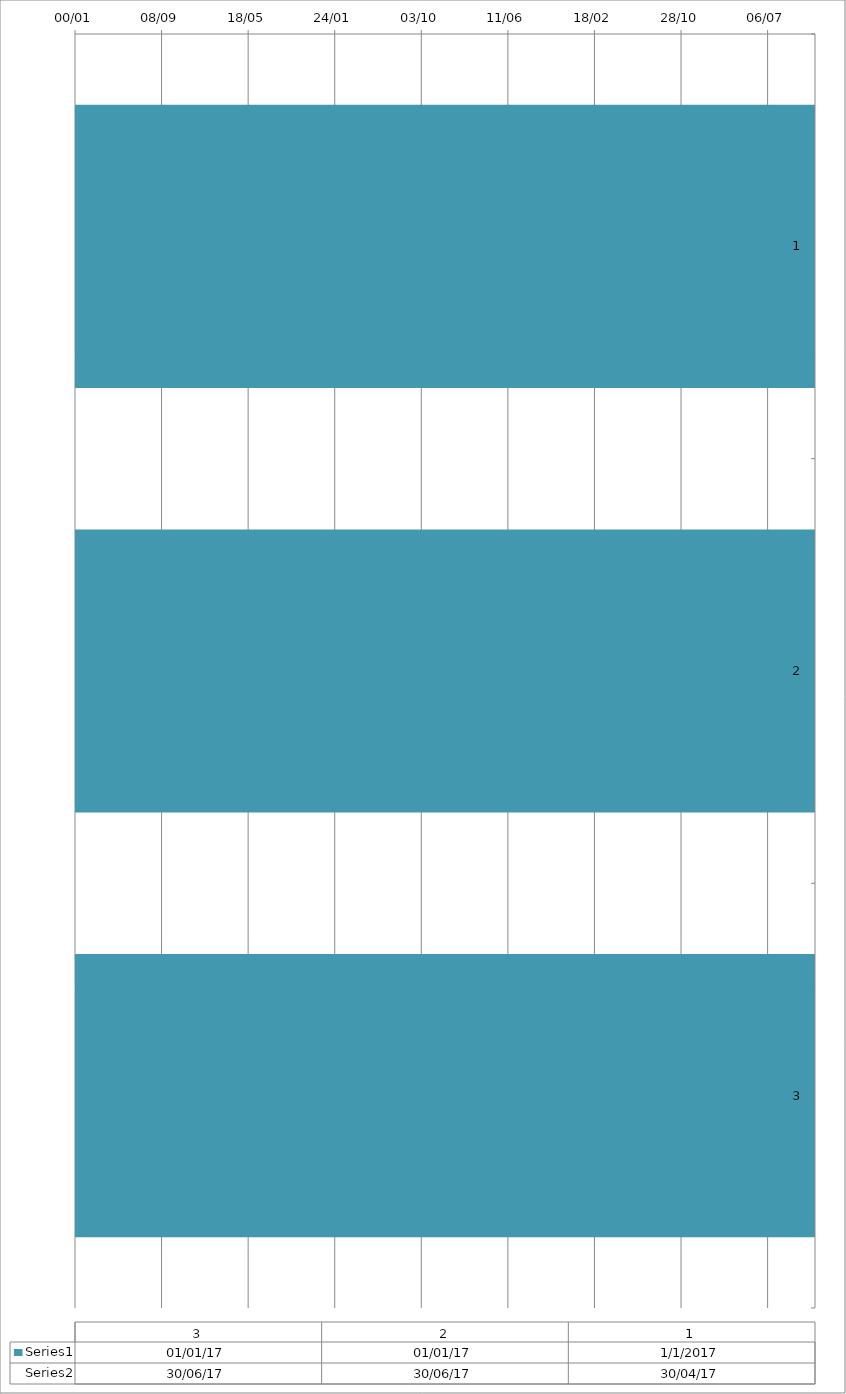
| Category | Series 4 | Series 5 |
|---|---|---|
| 0 | 2017-01-01 | 2017-04-30 |
| 1 | 2017-01-01 | 2017-06-30 |
| 2 | 2017-01-01 | 2017-06-30 |